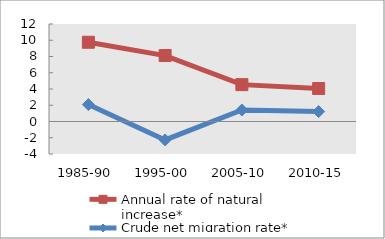
| Category | Annual rate of natural increase* | Crude net migration rate* |
|---|---|---|
| 1985-90 | 9.753 | 2.084 |
| 1995-00 | 8.116 | -2.271 |
| 2005-10 | 4.537 | 1.415 |
| 2010-15 | 4.058 | 1.222 |